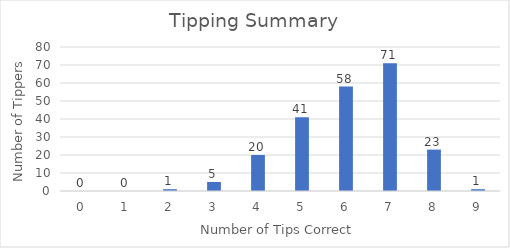
| Category | Count |
|---|---|
| 0.0 | 0 |
| 1.0 | 0 |
| 2.0 | 1 |
| 3.0 | 5 |
| 4.0 | 20 |
| 5.0 | 41 |
| 6.0 | 58 |
| 7.0 | 71 |
| 8.0 | 23 |
| 9.0 | 1 |